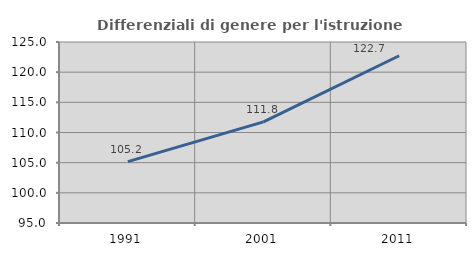
| Category | Differenziali di genere per l'istruzione superiore |
|---|---|
| 1991.0 | 105.17 |
| 2001.0 | 111.769 |
| 2011.0 | 122.724 |